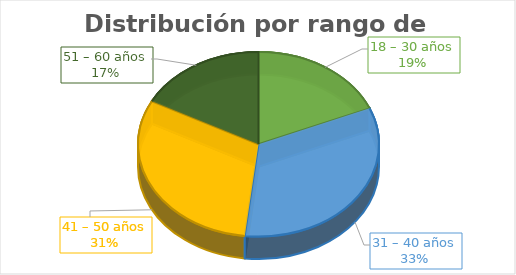
| Category | Series 0 |
|---|---|
| 18 – 30 años | 41 |
| 31 – 40 años | 73 |
| 41 – 50 años | 68 |
| 51 – 60 años | 38 |